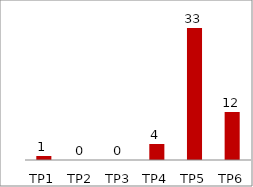
| Category | Series 0 |
|---|---|
| TP1 | 1 |
| TP2 | 0 |
| TP3 | 0 |
| TP4 | 4 |
| TP5 | 33 |
| TP6 | 12 |